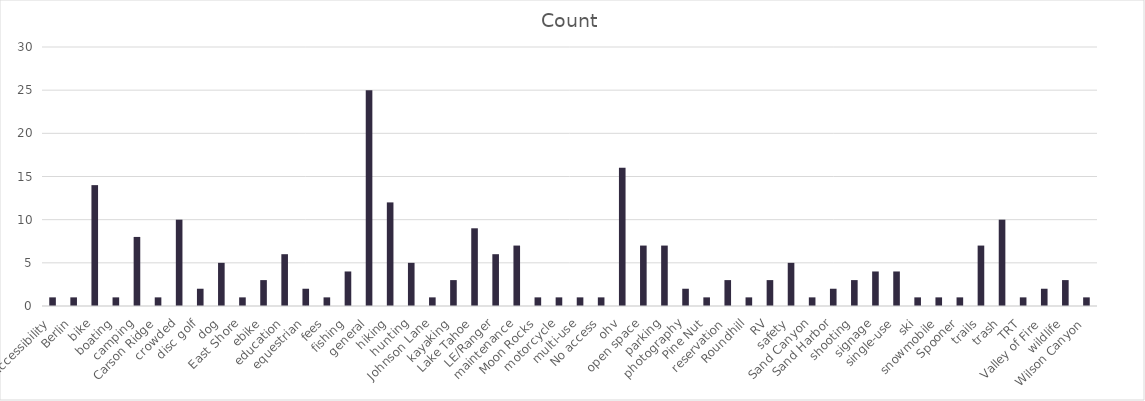
| Category | Count |
|---|---|
| accessibility | 1 |
| Berlin | 1 |
| bike | 14 |
| boating | 1 |
| camping | 8 |
| Carson Ridge | 1 |
| crowded | 10 |
| disc golf | 2 |
| dog | 5 |
| East Shore | 1 |
| ebike | 3 |
| education | 6 |
| equestrian | 2 |
| fees | 1 |
| fishing | 4 |
| general | 25 |
| hiking | 12 |
| hunting | 5 |
| Johnson Lane | 1 |
| kayaking | 3 |
| Lake Tahoe | 9 |
| LE/Ranger | 6 |
| maintenance | 7 |
| Moon Rocks | 1 |
| motorcycle | 1 |
| multi-use | 1 |
| No access | 1 |
| ohv | 16 |
| open space | 7 |
| parking | 7 |
| photography | 2 |
| Pine Nut | 1 |
| reservation | 3 |
| Roundhill | 1 |
| RV | 3 |
| safety | 5 |
| Sand Canyon | 1 |
| Sand Harbor | 2 |
| shooting | 3 |
| signage | 4 |
| single-use | 4 |
| ski | 1 |
| snowmobile | 1 |
| Spooner | 1 |
| trails | 7 |
| trash | 10 |
| TRT | 1 |
| Valley of Fire | 2 |
| wildlife | 3 |
| Wilson Canyon | 1 |